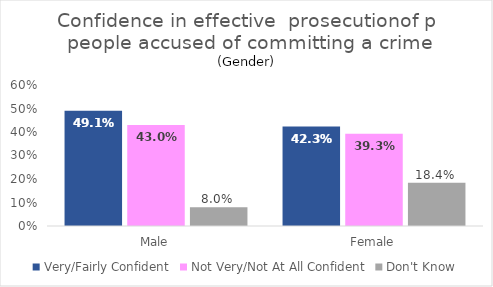
| Category | Very/Fairly Confident | Not Very/Not At All Confident | Don't Know |
|---|---|---|---|
| Male | 0.491 | 0.43 | 0.08 |
| Female | 0.423 | 0.393 | 0.184 |